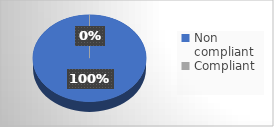
| Category | Series 0 |
|---|---|
| Non compliant | 11 |
| Compliant | 0 |